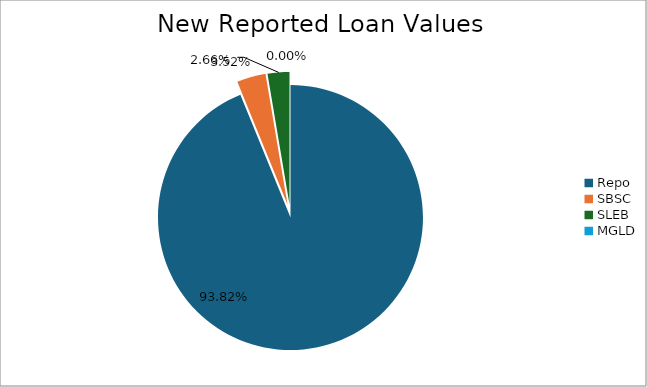
| Category | Series 0 |
|---|---|
| Repo | 13604751.351 |
| SBSC | 510692.875 |
| SLEB | 385142.074 |
| MGLD | 373.388 |